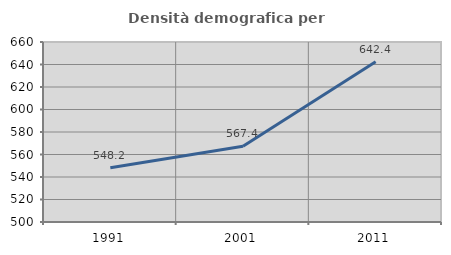
| Category | Densità demografica |
|---|---|
| 1991.0 | 548.242 |
| 2001.0 | 567.409 |
| 2011.0 | 642.389 |